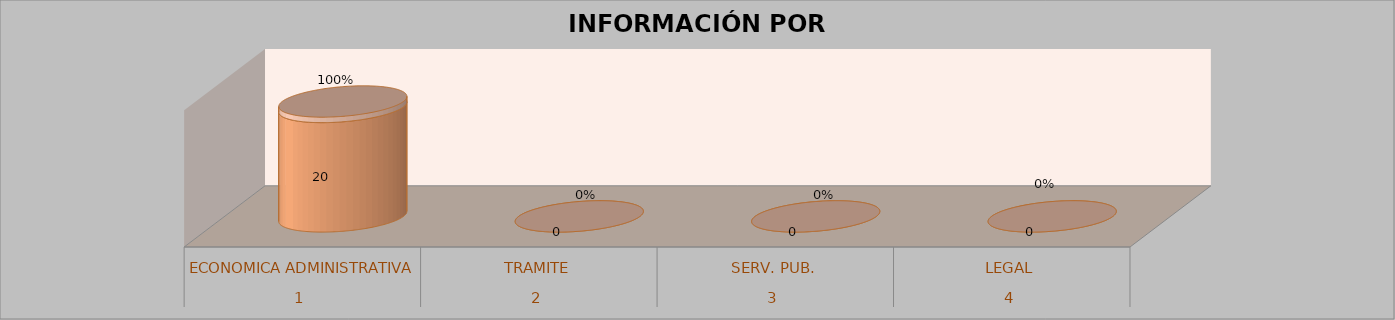
| Category | Series 0 | Series 1 | Series 2 | Series 3 |
|---|---|---|---|---|
| 0 |  |  | 20 | 1 |
| 1 |  |  | 0 | 0 |
| 2 |  |  | 0 | 0 |
| 3 |  |  | 0 | 0 |